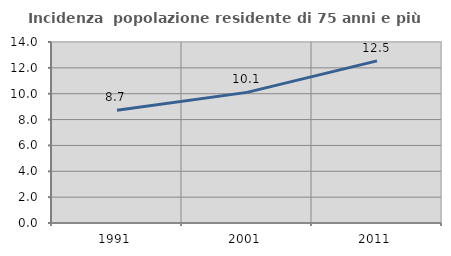
| Category | Incidenza  popolazione residente di 75 anni e più |
|---|---|
| 1991.0 | 8.729 |
| 2001.0 | 10.104 |
| 2011.0 | 12.541 |